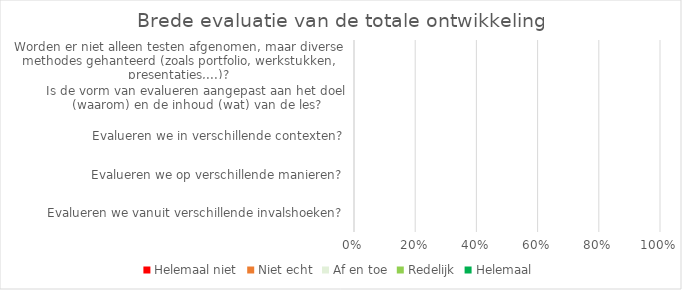
| Category | Helemaal niet | Niet echt | Af en toe | Redelijk | Helemaal |
|---|---|---|---|---|---|
| Evalueren we vanuit verschillende invalshoeken? | 0 | 0 | 0 | 0 | 0 |
| Evalueren we op verschillende manieren? | 0 | 0 | 0 | 0 | 0 |
| Evalueren we in verschillende contexten? | 0 | 0 | 0 | 0 | 0 |
| Is de vorm van evalueren aangepast aan het doel (waarom) en de inhoud (wat) van de les? | 0 | 0 | 0 | 0 | 0 |
| Worden er niet alleen testen afgenomen, maar diverse methodes gehanteerd (zoals portfolio, werkstukken, presentaties,...)? | 0 | 0 | 0 | 0 | 0 |